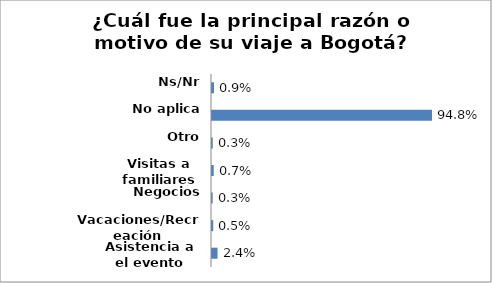
| Category | Series 0 |
|---|---|
| Asistencia a el evento | 0.024 |
| Vacaciones/Recreación | 0.005 |
| Negocios | 0.003 |
| Visitas a familiares o amigos | 0.007 |
| Otro | 0.003 |
| No aplica | 0.948 |
| Ns/Nr | 0.009 |